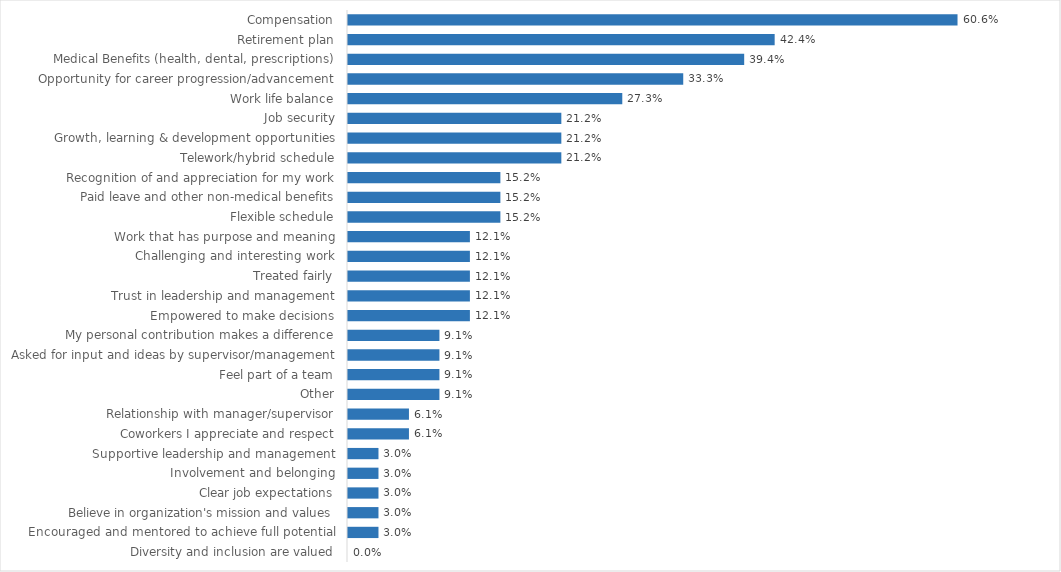
| Category | Military |
|---|---|
| Compensation | 0.606 |
| Retirement plan | 0.424 |
| Medical Benefits (health, dental, prescriptions) | 0.394 |
| Opportunity for career progression/advancement | 0.333 |
| Work life balance | 0.273 |
| Job security | 0.212 |
| Growth, learning & development opportunities | 0.212 |
| Telework/hybrid schedule | 0.212 |
| Recognition of and appreciation for my work | 0.152 |
| Paid leave and other non-medical benefits | 0.152 |
| Flexible schedule | 0.152 |
| Work that has purpose and meaning | 0.121 |
| Challenging and interesting work | 0.121 |
| Treated fairly | 0.121 |
| Trust in leadership and management | 0.121 |
| Empowered to make decisions | 0.121 |
| My personal contribution makes a difference | 0.091 |
| Asked for input and ideas by supervisor/management | 0.091 |
| Feel part of a team | 0.091 |
| Other | 0.091 |
| Relationship with manager/supervisor | 0.061 |
| Coworkers I appreciate and respect | 0.061 |
| Supportive leadership and management | 0.03 |
| Involvement and belonging | 0.03 |
| Clear job expectations | 0.03 |
| Believe in organization's mission and values | 0.03 |
| Encouraged and mentored to achieve full potential | 0.03 |
| Diversity and inclusion are valued | 0 |